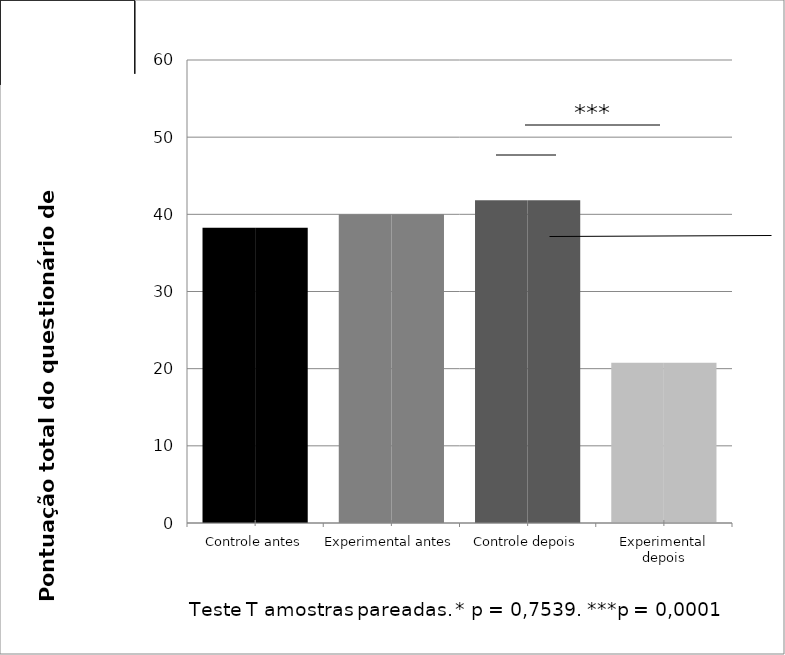
| Category | Pontuação total do questionário de lombalgia |
|---|---|
| Controle antes | 38.26 |
| Experimental antes | 40 |
| Controle depois | 41.84 |
| Experimental depois | 20.76 |